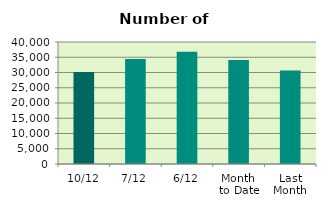
| Category | Series 0 |
|---|---|
| 10/12 | 30152 |
| 7/12 | 34428 |
| 6/12 | 36784 |
| Month 
to Date | 34092.667 |
| Last
Month | 30687.818 |